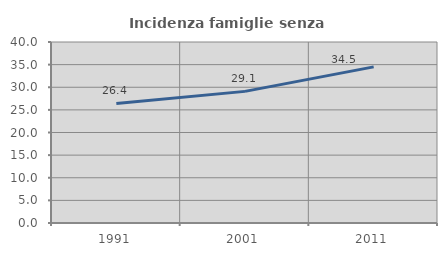
| Category | Incidenza famiglie senza nuclei |
|---|---|
| 1991.0 | 26.419 |
| 2001.0 | 29.09 |
| 2011.0 | 34.502 |